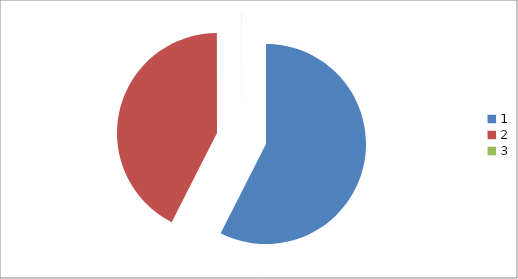
| Category | Series 0 |
|---|---|
| 0 | 1640 |
| 1 | 1212 |
| 2 | 0.731 |